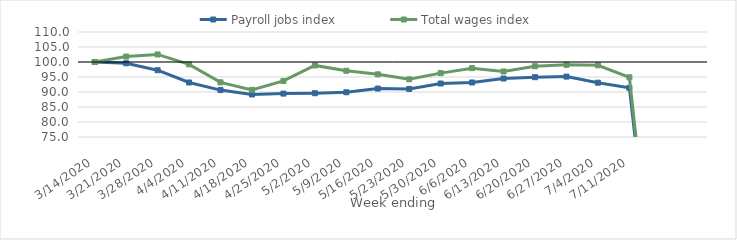
| Category | Payroll jobs index | Total wages index |
|---|---|---|
| 14/03/2020 | 100 | 100 |
| 21/03/2020 | 99.577 | 101.818 |
| 28/03/2020 | 97.26 | 102.521 |
| 04/04/2020 | 93.177 | 99.216 |
| 11/04/2020 | 90.634 | 93.216 |
| 18/04/2020 | 89.174 | 90.7 |
| 25/04/2020 | 89.469 | 93.683 |
| 02/05/2020 | 89.595 | 98.855 |
| 09/05/2020 | 89.918 | 97.082 |
| 16/05/2020 | 91.141 | 95.886 |
| 23/05/2020 | 91.021 | 94.225 |
| 30/05/2020 | 92.826 | 96.298 |
| 06/06/2020 | 93.174 | 97.949 |
| 13/06/2020 | 94.491 | 96.842 |
| 20/06/2020 | 94.937 | 98.598 |
| 27/06/2020 | 95.13 | 99.049 |
| 04/07/2020 | 93.1 | 98.898 |
| 11/07/2020 | 91.383 | 94.91 |